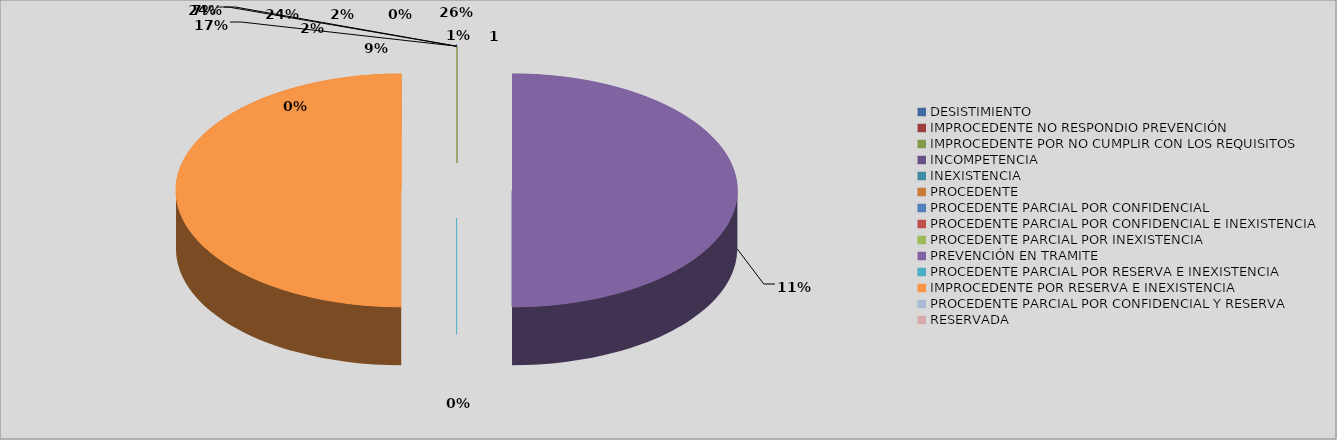
| Category | Series 0 | Series 1 |
|---|---|---|
| DESISTIMIENTO | 0 | 0 |
| IMPROCEDENTE NO RESPONDIO PREVENCIÓN | 0 | 0 |
| IMPROCEDENTE POR NO CUMPLIR CON LOS REQUISITOS | 0 | 0 |
| INCOMPETENCIA | 0 | 0 |
| INEXISTENCIA  | 0 | 0 |
| PROCEDENTE | 0 | 0 |
| PROCEDENTE PARCIAL POR CONFIDENCIAL | 0 | 0 |
| PROCEDENTE PARCIAL POR CONFIDENCIAL E INEXISTENCIA | 0 | 0 |
| PROCEDENTE PARCIAL POR INEXISTENCIA | 0 | 0 |
| PREVENCIÓN EN TRAMITE | 1 | 0.003 |
| PROCEDENTE PARCIAL POR RESERVA E INEXISTENCIA | 0 | 0 |
| IMPROCEDENTE POR RESERVA E INEXISTENCIA | 1 | 0.003 |
| PROCEDENTE PARCIAL POR CONFIDENCIAL Y RESERVA | 0 | 0 |
| RESERVADA | 0 | 0 |